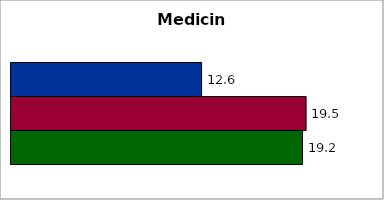
| Category | 50 states and D.C. | SREB states | State |
|---|---|---|---|
| 0 | 12.567 | 19.457 | 19.221 |